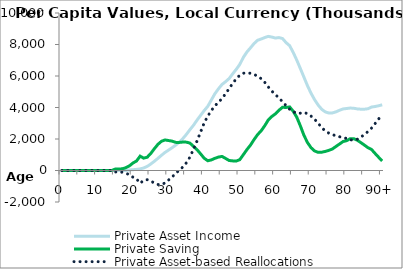
| Category | Private Asset Income | Private Saving | Private Asset-based Reallocations |
|---|---|---|---|
| 0 | 0 | 0 | 0 |
|  | 0 | 0 | 0 |
| 2 | 0 | 0 | 0 |
| 3 | 0 | 0 | 0 |
| 4 | 0 | 0 | 0 |
| 5 | 0 | 0 | 0 |
| 6 | 0 | 0 | 0 |
| 7 | 0 | 0 | 0 |
| 8 | 0 | 0 | 0 |
| 9 | 0 | 0 | 0 |
| 10 | 0 | 0 | 0 |
| 11 | 0 | 0 | 0 |
| 12 | 0 | 0 | 0 |
| 13 | 0 | 0 | 0 |
| 14 | 0 | 0 | 0 |
| 15 | 0 | 90722.41 | -90722.41 |
| 16 | 0 | 89699.626 | -89699.626 |
| 17 | 62.148 | 109378.945 | -109316.797 |
| 18 | 1491.541 | 179109.279 | -177617.739 |
| 19 | 33885.388 | 294552.765 | -260667.377 |
| 20 | 50766.5 | 477911.055 | -427144.555 |
| 21 | 69878.337 | 604325.765 | -534447.429 |
| 22 | 100497.304 | 910303.375 | -809806.071 |
| 23 | 160603.182 | 784477.47 | -623874.288 |
| 24 | 261078.747 | 844978.157 | -583899.41 |
| 25 | 412099.552 | 1084270.824 | -672171.272 |
| 26 | 584257.623 | 1381552.654 | -797295.031 |
| 27 | 770858.537 | 1659966.925 | -889108.387 |
| 28 | 966355.127 | 1855124.181 | -888769.054 |
| 29 | 1147839.463 | 1939943.407 | -792103.943 |
| 30 | 1297293.748 | 1900896.566 | -603602.819 |
| 31 | 1448478.946 | 1863809.716 | -415330.77 |
| 32 | 1612543.05 | 1785868.046 | -173324.996 |
| 33 | 1798205.961 | 1783166.142 | 15039.818 |
| 34 | 2025822.859 | 1804669.209 | 221153.65 |
| 35 | 2291785.823 | 1801243.168 | 490542.656 |
| 36 | 2594864.639 | 1739232.512 | 855632.127 |
| 37 | 2873221.054 | 1522643.433 | 1350577.621 |
| 38 | 3201620.092 | 1318851.641 | 1882768.452 |
| 39 | 3504886.899 | 1052275.599 | 2452611.3 |
| 40 | 3802969.842 | 779361.722 | 3023608.119 |
| 41 | 4073183.222 | 618887.449 | 3454295.774 |
| 42 | 4474778.238 | 671837.224 | 3802941.014 |
| 43 | 4872706.859 | 773233.319 | 4099473.54 |
| 44 | 5184317.983 | 851182.69 | 4333135.293 |
| 45 | 5461173.418 | 893245.019 | 4567928.399 |
| 46 | 5639491.835 | 767701.71 | 4871790.125 |
| 47 | 5835775.599 | 635062.996 | 5200712.603 |
| 48 | 6137804.929 | 610853.791 | 5526951.138 |
| 49 | 6421407.559 | 599430.852 | 5821976.708 |
| 50 | 6738383.287 | 689345.819 | 6049037.468 |
| 51 | 7184886.561 | 1006754.39 | 6178132.171 |
| 52 | 7525154.214 | 1326182.483 | 6198971.731 |
| 53 | 7787017.874 | 1613185.708 | 6173832.166 |
| 54 | 8059521.266 | 1961396.843 | 6098124.423 |
| 55 | 8268710.003 | 2279825.411 | 5988884.592 |
| 56 | 8349207.025 | 2519644.084 | 5829562.942 |
| 57 | 8439360.27 | 2840774.866 | 5598585.405 |
| 58 | 8514928.675 | 3210207.841 | 5304720.834 |
| 59 | 8470963.269 | 3430713.267 | 5040250.002 |
| 60 | 8409512.662 | 3597284.473 | 4812228.19 |
| 61 | 8439840.686 | 3827218.767 | 4612621.918 |
| 62 | 8378247.404 | 4014126.527 | 4364120.877 |
| 63 | 8119799.504 | 4001923.913 | 4117875.591 |
| 64 | 7924924.44 | 4037434.548 | 3887489.892 |
| 65 | 7497174.723 | 3759441.881 | 3737732.842 |
| 66 | 7007516.728 | 3380639.456 | 3626877.272 |
| 67 | 6478210.23 | 2838385.004 | 3639825.226 |
| 68 | 5933066.795 | 2242100.837 | 3690965.959 |
| 69 | 5388148.016 | 1778743.937 | 3609404.08 |
| 70 | 4906720.676 | 1449346.043 | 3457374.633 |
| 71 | 4500094.263 | 1242041.318 | 3258052.945 |
| 72 | 4155359.089 | 1151827.829 | 3003531.259 |
| 73 | 3888093.202 | 1161643.542 | 2726449.66 |
| 74 | 3721619.106 | 1210915.349 | 2510703.757 |
| 75 | 3650307.93 | 1278251.882 | 2372056.048 |
| 76 | 3655600.842 | 1364854.324 | 2290746.519 |
| 77 | 3722249.447 | 1526108.404 | 2196141.042 |
| 78 | 3822800.112 | 1678971.166 | 2143828.946 |
| 79 | 3907978.313 | 1839147.048 | 2068831.265 |
| 80 | 3936251 | 1893669.802 | 2042581.198 |
| 81 | 3964499.176 | 2017896.679 | 1946602.497 |
| 82 | 3952933.224 | 2019606.083 | 1933327.141 |
| 83 | 3910659.551 | 1922635.947 | 1988023.604 |
| 84 | 3891884.502 | 1770883.597 | 2121000.904 |
| 85 | 3892080.135 | 1611778.19 | 2280301.945 |
| 86 | 3921009.757 | 1447282.828 | 2473726.93 |
| 87 | 4028671.466 | 1335048.636 | 2693622.83 |
| 88 | 4062825.29 | 1081435.556 | 2981389.734 |
| 89 | 4110158.06 | 838314.707 | 3271843.353 |
| 90+ | 4171390.148 | 609691.437 | 3561698.711 |